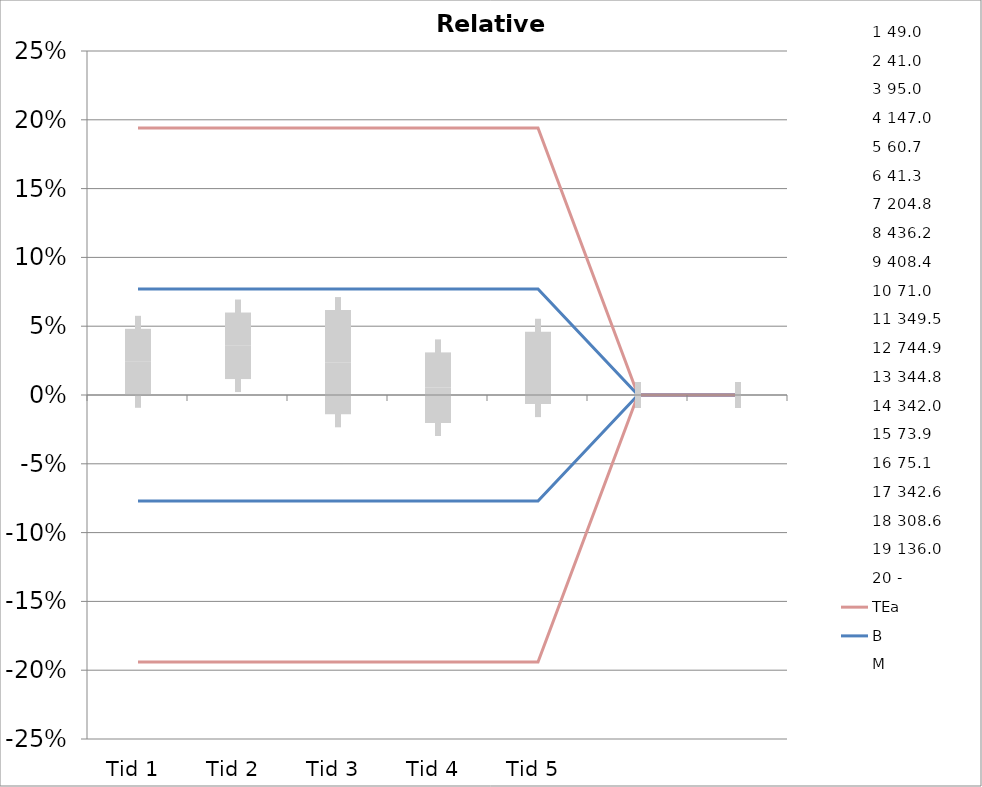
| Category | 1 | 2 | 3 | 4 | 5 | 6 | 7 | 8 | 9 | 10 | 11 | 12 | 13 | 14 | 15 | 16 | 17 | 18 | 19 | 20 | TEa | B | -B | -TEa | M |
|---|---|---|---|---|---|---|---|---|---|---|---|---|---|---|---|---|---|---|---|---|---|---|---|---|---|
| Tid 1 | 0.059 | 0.017 | 0.085 | 0.014 | 0.082 | 0.046 | 0.003 | 0.083 | 0.063 | 0.03 | -0.018 | -0.015 | -0.036 | -0.023 | -0.028 | 0 | 0 | 0 | 0 | 0 | 0.194 | 0.077 | -0.077 | -0.194 | 0.024 |
| Tid 2 | 0.09 | 0.034 | 0.076 | 0.046 | 0.079 | 0.068 | 0 | 0.095 | 0.037 | 0.058 | -0.039 | 0.026 | -0.042 | 0.014 | -0.005 | 0 | 0 | 0 | 0 | 0 | 0.194 | 0.077 | -0.077 | -0.194 | 0.036 |
| Tid 3 | 0.141 | -0.002 | 0.075 | 0.015 | 0.089 | 0.107 | -0.01 | 0.067 | 0.027 | 0.032 | -0.052 | -0.015 | -0.064 | 0 | -0.076 | 0 | 0 | 0 | 0 | 0 | 0.194 | 0.077 | -0.077 | -0.194 | 0.024 |
| Tid 4 | 0.122 | -0.02 | 0.116 | -0.076 | 0.002 | 0.046 | -0.013 | 0 | 0.012 | 0.024 | -0.025 | -0.037 | -0.017 | 0 | -0.003 | -0.044 | 0.051 | -0.031 | -0.017 | 0 | 0.194 | 0.077 | -0.077 | -0.194 | 0.005 |
| Tid 5 | 0 | -0.02 | 0.025 | -0.037 | 0.099 | 0.07 | 0 | 0 | 0.045 | 0.024 | 0 | 0 | 0 | 0 | 0 | -0.045 | 0.055 | -0.026 | 0.046 | 0 | 0.194 | 0.077 | -0.077 | -0.194 | 0.02 |